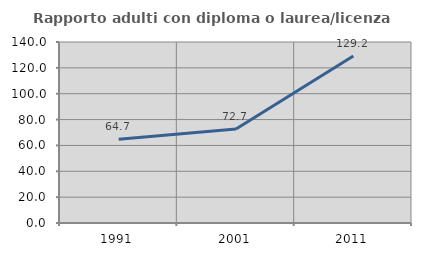
| Category | Rapporto adulti con diploma o laurea/licenza media  |
|---|---|
| 1991.0 | 64.706 |
| 2001.0 | 72.727 |
| 2011.0 | 129.167 |